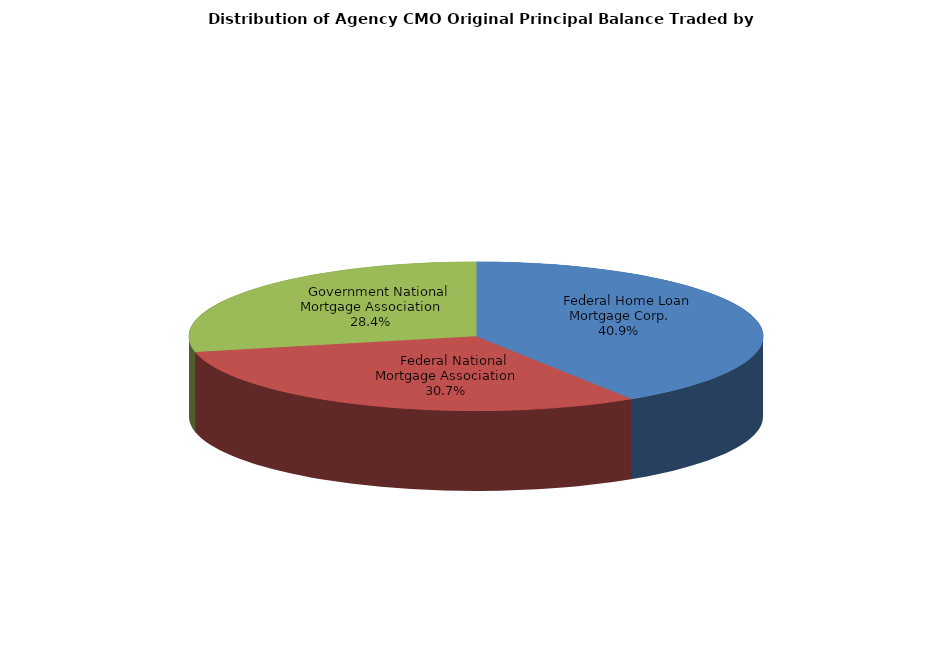
| Category | Series 0 |
|---|---|
|     Federal Home Loan Mortgage Corp. | 2641388738.963 |
|     Federal National Mortgage Association | 1980948178.608 |
|     Government National Mortgage Association | 1830765680.295 |